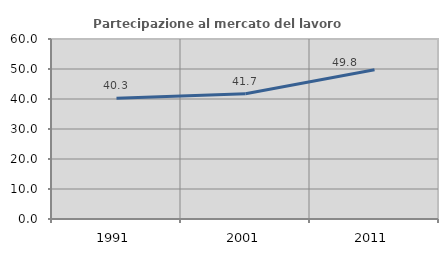
| Category | Partecipazione al mercato del lavoro  femminile |
|---|---|
| 1991.0 | 40.258 |
| 2001.0 | 41.739 |
| 2011.0 | 49.778 |